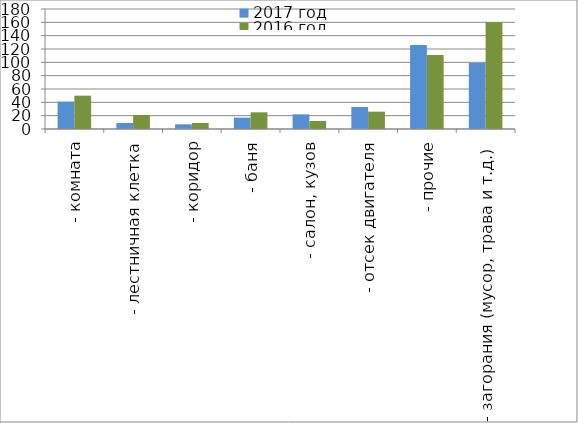
| Category | 2017 год | 2016 год |
|---|---|---|
|  - комната | 41 | 50 |
|  - лестничная клетка | 9 | 21 |
|  - коридор | 7 | 9 |
|  - баня | 17 | 25 |
|  - салон, кузов | 22 | 12 |
|  - отсек двигателя | 33 | 26 |
| - прочие | 126 | 111 |
| - загорания (мусор, трава и т.д.)  | 99 | 160 |